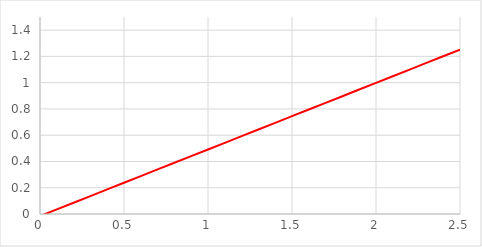
| Category | Series 0 |
|---|---|
| 0.0 | -0.016 |
| 0.1 | 0.035 |
| 0.2 | 0.086 |
| 0.30000000000000004 | 0.137 |
| 0.4 | 0.187 |
| 0.5 | 0.238 |
| 0.6 | 0.289 |
| 0.7 | 0.339 |
| 0.7999999999999999 | 0.39 |
| 0.8999999999999999 | 0.441 |
| 0.9999999999999999 | 0.491 |
| 1.0999999999999999 | 0.542 |
| 1.2 | 0.593 |
| 1.3 | 0.643 |
| 1.4000000000000001 | 0.694 |
| 1.5000000000000002 | 0.745 |
| 1.6000000000000003 | 0.796 |
| 1.7000000000000004 | 0.846 |
| 1.8000000000000005 | 0.897 |
| 1.9000000000000006 | 0.948 |
| 2.0000000000000004 | 0.998 |
| 2.1000000000000005 | 1.049 |
| 2.2000000000000006 | 1.1 |
| 2.3000000000000007 | 1.15 |
| 2.400000000000001 | 1.201 |
| 2.500000000000001 | 1.252 |